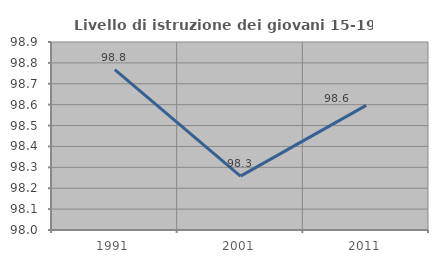
| Category | Livello di istruzione dei giovani 15-19 anni |
|---|---|
| 1991.0 | 98.768 |
| 2001.0 | 98.258 |
| 2011.0 | 98.596 |